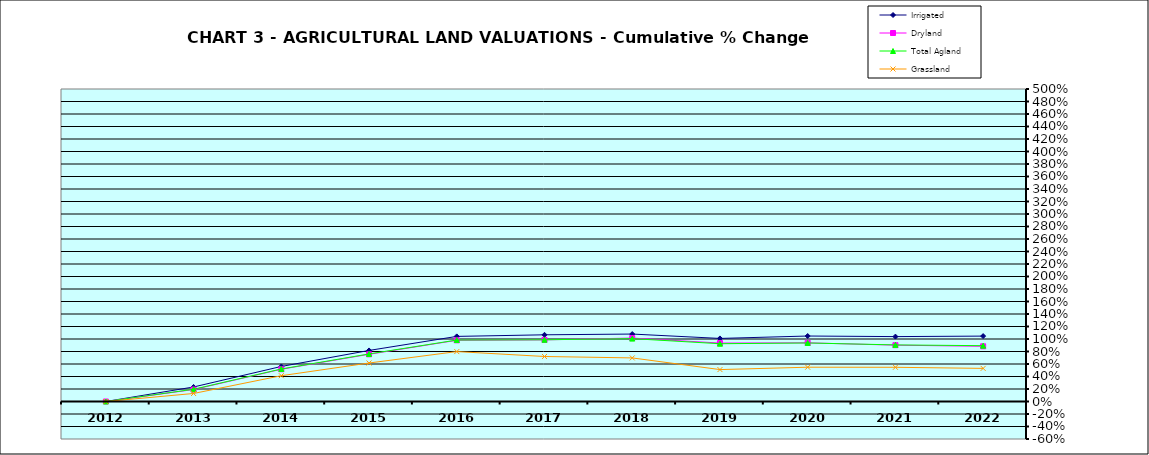
| Category | Irrigated | Dryland | Total Agland | Grassland |
|---|---|---|---|---|
| 2012.0 | 0 | 0 | 0 | 0 |
| 2013.0 | 0.232 | 0.191 | 0.196 | 0.128 |
| 2014.0 | 0.561 | 0.516 | 0.52 | 0.413 |
| 2015.0 | 0.817 | 0.755 | 0.761 | 0.616 |
| 2016.0 | 1.042 | 0.979 | 0.983 | 0.799 |
| 2017.0 | 1.067 | 0.986 | 0.988 | 0.72 |
| 2018.0 | 1.079 | 1.015 | 1.006 | 0.697 |
| 2019.0 | 1.009 | 0.935 | 0.924 | 0.511 |
| 2020.0 | 1.048 | 0.939 | 0.936 | 0.549 |
| 2021.0 | 1.038 | 0.901 | 0.905 | 0.547 |
| 2022.0 | 1.046 | 0.883 | 0.893 | 0.53 |